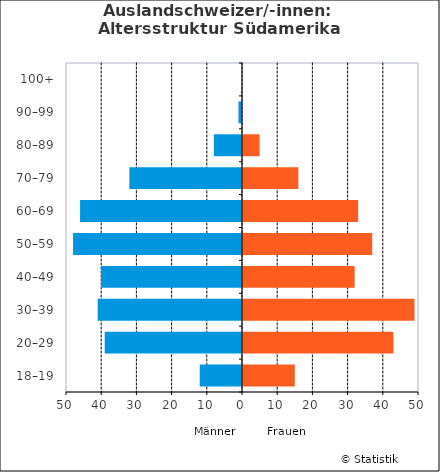
| Category | Männer | Frauen |
|---|---|---|
| 18–19 | -12 | 15 |
| 20–29 | -39 | 43 |
| 30–39 | -41 | 49 |
| 40–49 | -40 | 32 |
| 50–59 | -48 | 37 |
| 60–69 | -46 | 33 |
| 70–79 | -32 | 16 |
| 80–89 | -8 | 5 |
| 90–99 | -1 | 0 |
| 100+ | 0 | 0 |